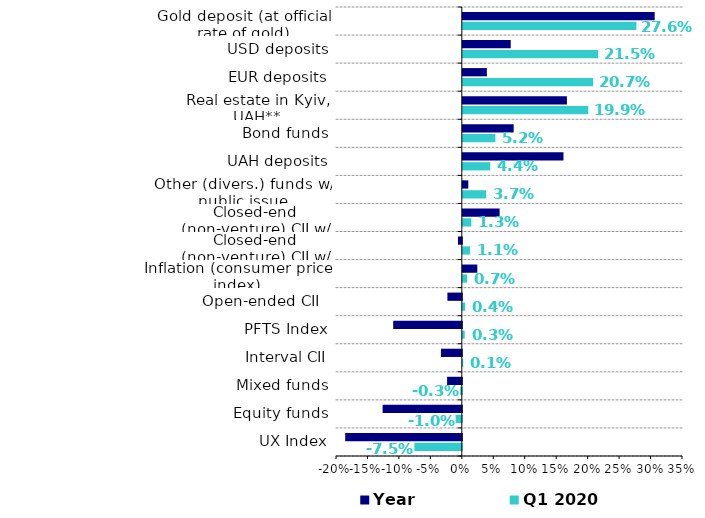
| Category | Q1 2020 | Year |
|---|---|---|
| UX Index | -0.075 | -0.185 |
| Equity funds | -0.01 | -0.126 |
| Mixed funds | -0.003 | -0.023 |
| Interval CII | 0.001 | -0.033 |
| PFTS Index | 0.003 | -0.109 |
| Open-ended CII   | 0.004 | -0.023 |
| Inflation (consumer price index) | 0.007 | 0.023 |
| Closed-end (non-venture) CII w/ public issue | 0.011 | -0.006 |
| Closed-end (non-venture) CII w/ private issue | 0.013 | 0.059 |
| Other (divers.) funds w/ public issue | 0.037 | 0.009 |
| UAH deposits | 0.044 | 0.16 |
| Bond funds | 0.052 | 0.081 |
| Real estate in Kyiv, UAH** | 0.199 | 0.165 |
| EUR deposits | 0.207 | 0.038 |
| USD deposits | 0.215 | 0.076 |
| Gold deposit (at official rate of gold) | 0.276 | 0.305 |